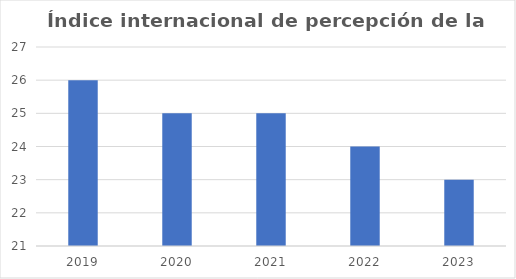
| Category | índice |
|---|---|
| 2019.0 | 26 |
| 2020.0 | 25 |
| 2021.0 | 25 |
| 2022.0 | 24 |
| 2023.0 | 23 |